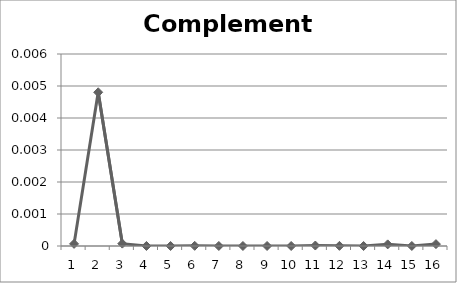
| Category | Series 0 |
|---|---|
| 0 | 0 |
| 1 | 0.005 |
| 2 | 0 |
| 3 | 0 |
| 4 | 0 |
| 5 | 0 |
| 6 | 0 |
| 7 | 0 |
| 8 | 0 |
| 9 | 0 |
| 10 | 0 |
| 11 | 0 |
| 12 | 0 |
| 13 | 0 |
| 14 | 0 |
| 15 | 0 |